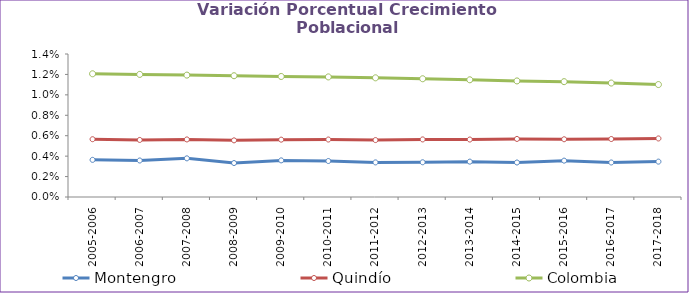
| Category | Montengro | Quindío | Colombia |
|---|---|---|---|
| 2005-2006 | 0.004 | 0.006 | 0.012 |
| 2006-2007 | 0.004 | 0.006 | 0.012 |
| 2007-2008 | 0.004 | 0.006 | 0.012 |
| 2008-2009 | 0.003 | 0.006 | 0.012 |
| 2009-2010 | 0.004 | 0.006 | 0.012 |
| 2010-2011 | 0.004 | 0.006 | 0.012 |
| 2011-2012 | 0.003 | 0.006 | 0.012 |
| 2012-2013 | 0.003 | 0.006 | 0.012 |
| 2013-2014 | 0.003 | 0.006 | 0.011 |
| 2014-2015 | 0.003 | 0.006 | 0.011 |
| 2015-2016 | 0.004 | 0.006 | 0.011 |
| 2016-2017 | 0.003 | 0.006 | 0.011 |
| 2017-2018 | 0.003 | 0.006 | 0.011 |